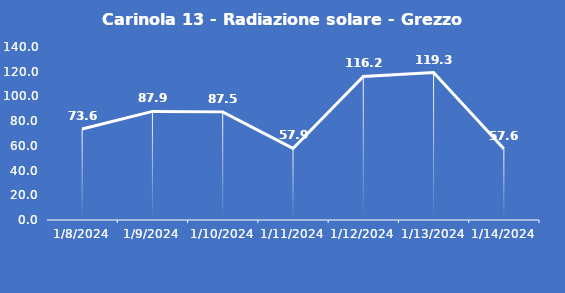
| Category | Carinola 13 - Radiazione solare - Grezzo (W/m2) |
|---|---|
| 1/8/24 | 73.6 |
| 1/9/24 | 87.9 |
| 1/10/24 | 87.5 |
| 1/11/24 | 57.9 |
| 1/12/24 | 116.2 |
| 1/13/24 | 119.3 |
| 1/14/24 | 57.6 |